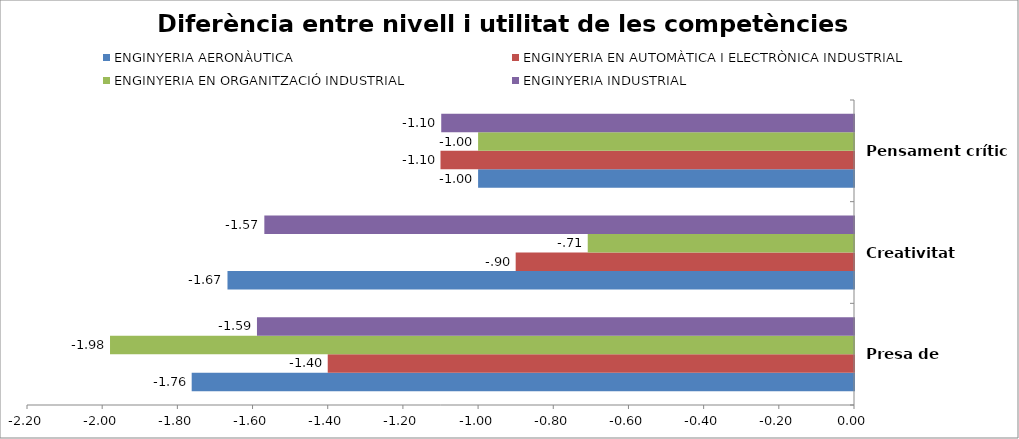
| Category | ENGINYERIA AERONÀUTICA | ENGINYERIA EN AUTOMÀTICA I ELECTRÒNICA INDUSTRIAL | ENGINYERIA EN ORGANITZACIÓ INDUSTRIAL | ENGINYERIA INDUSTRIAL |
|---|---|---|---|---|
| Presa de decisions | -1.762 | -1.4 | -1.979 | -1.588 |
| Creativitat | -1.667 | -0.9 | -0.708 | -1.569 |
| Pensament crític | -1 | -1.1 | -1 | -1.098 |